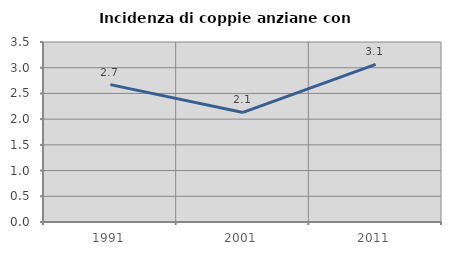
| Category | Incidenza di coppie anziane con figli |
|---|---|
| 1991.0 | 2.671 |
| 2001.0 | 2.13 |
| 2011.0 | 3.066 |